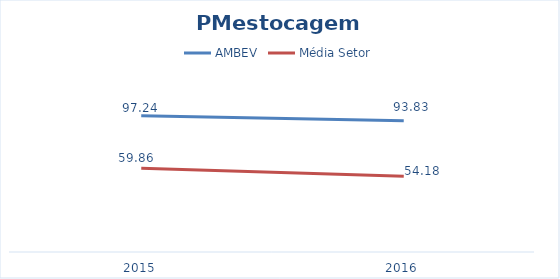
| Category | AMBEV | Média Setor |
|---|---|---|
| 2015.0 | 97.236 | 59.855 |
| 2016.0 | 93.833 | 54.179 |